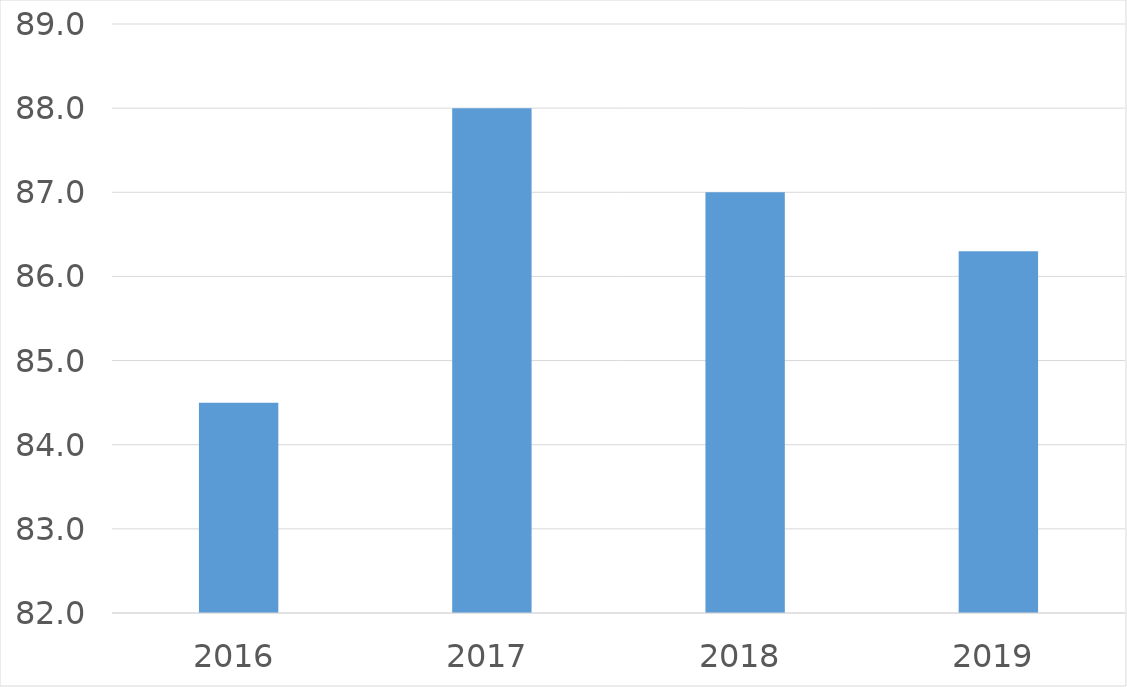
| Category | Series 0 |
|---|---|
| 2016 | 84.5 |
| 2017 | 88 |
| 2018 | 87 |
| 2019 | 86.3 |